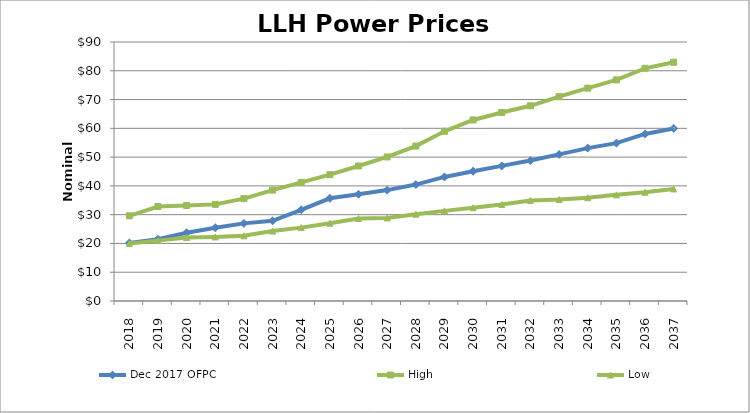
| Category | Dec 2017 OFPC | High | Low |
|---|---|---|---|
| 2018.0 | 20.175 | 29.599 | 19.965 |
| 2019.0 | 21.489 | 32.84 | 20.976 |
| 2020.0 | 23.702 | 33.168 | 22.024 |
| 2021.0 | 25.477 | 33.574 | 22.246 |
| 2022.0 | 26.975 | 35.581 | 22.658 |
| 2023.0 | 27.856 | 38.544 | 24.289 |
| 2024.0 | 31.693 | 41.224 | 25.499 |
| 2025.0 | 35.69 | 43.903 | 27.026 |
| 2026.0 | 37.078 | 46.911 | 28.651 |
| 2027.0 | 38.536 | 50.054 | 28.865 |
| 2028.0 | 40.455 | 53.829 | 30.172 |
| 2029.0 | 43.11 | 58.977 | 31.314 |
| 2030.0 | 45.096 | 62.91 | 32.417 |
| 2031.0 | 46.946 | 65.497 | 33.515 |
| 2032.0 | 48.809 | 67.834 | 34.91 |
| 2033.0 | 50.961 | 70.987 | 35.257 |
| 2034.0 | 53.132 | 73.964 | 35.888 |
| 2035.0 | 54.858 | 76.823 | 36.885 |
| 2036.0 | 58.053 | 80.856 | 37.771 |
| 2037.0 | 59.961 | 82.975 | 38.926 |